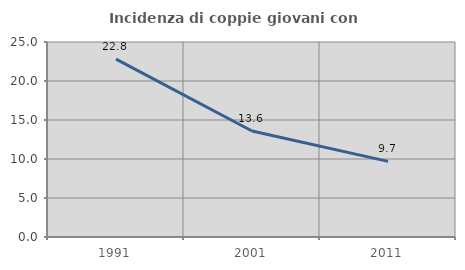
| Category | Incidenza di coppie giovani con figli |
|---|---|
| 1991.0 | 22.796 |
| 2001.0 | 13.591 |
| 2011.0 | 9.693 |